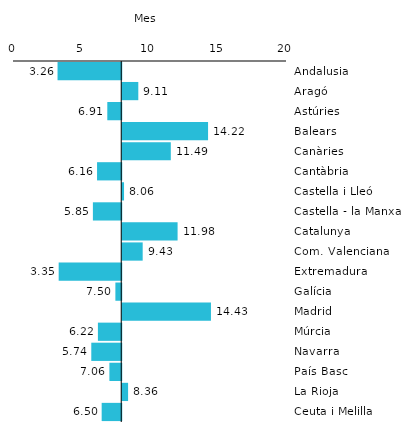
| Category | Series 0 |
|---|---|
| Andalusia | 3.263 |
| Aragó | 9.107 |
| Astúries | 6.908 |
| Balears | 14.217 |
| Canàries | 11.488 |
| Cantàbria | 6.158 |
| Castella i Lleó | 8.061 |
| Castella - la Manxa | 5.852 |
| Catalunya | 11.985 |
| Com. Valenciana | 9.428 |
| Extremadura | 3.346 |
| Galícia | 7.5 |
| Madrid | 14.429 |
| Múrcia | 6.22 |
| Navarra | 5.735 |
| País Basc | 7.062 |
| La Rioja | 8.358 |
| Ceuta i Melilla | 6.495 |